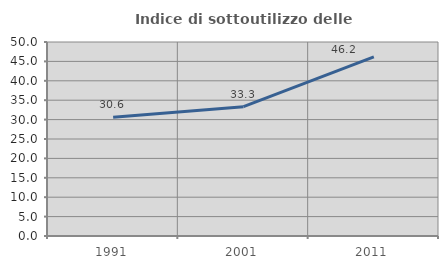
| Category | Indice di sottoutilizzo delle abitazioni  |
|---|---|
| 1991.0 | 30.628 |
| 2001.0 | 33.326 |
| 2011.0 | 46.178 |